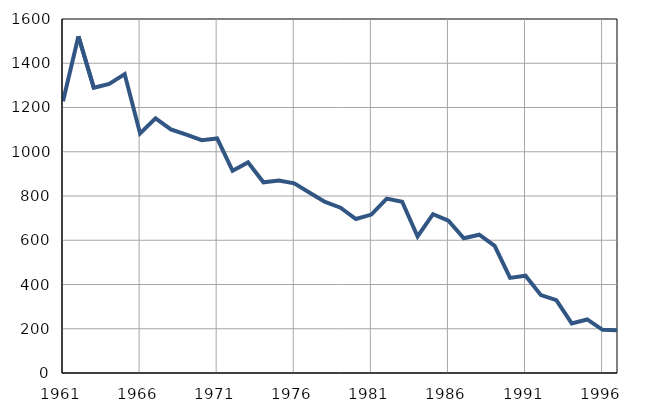
| Category | Infants
deaths |
|---|---|
| 1961.0 | 1228 |
| 1962.0 | 1522 |
| 1963.0 | 1289 |
| 1964.0 | 1307 |
| 1965.0 | 1351 |
| 1966.0 | 1083 |
| 1967.0 | 1151 |
| 1968.0 | 1101 |
| 1969.0 | 1077 |
| 1970.0 | 1052 |
| 1971.0 | 1060 |
| 1972.0 | 914 |
| 1973.0 | 952 |
| 1974.0 | 862 |
| 1975.0 | 870 |
| 1976.0 | 857 |
| 1977.0 | 815 |
| 1978.0 | 773 |
| 1979.0 | 747 |
| 1980.0 | 696 |
| 1981.0 | 716 |
| 1982.0 | 788 |
| 1983.0 | 774 |
| 1984.0 | 617 |
| 1985.0 | 718 |
| 1986.0 | 688 |
| 1987.0 | 609 |
| 1988.0 | 625 |
| 1989.0 | 575 |
| 1990.0 | 430 |
| 1991.0 | 440 |
| 1992.0 | 352 |
| 1993.0 | 329 |
| 1994.0 | 224 |
| 1995.0 | 242 |
| 1996.0 | 195 |
| 1997.0 | 193 |